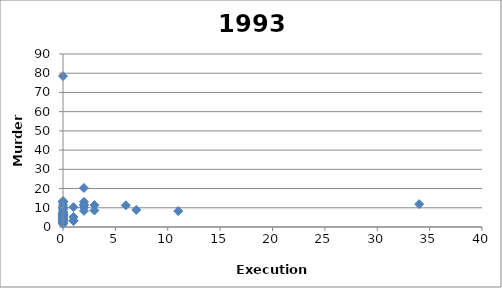
| Category | Series 0 |
|---|---|
| 2.0 | 11.6 |
| 0.0 | 9 |
| 3.0 | 8.6 |
| 2.0 | 10.2 |
| 2.0 | 13.1 |
| 0.0 | 5.8 |
| 0.0 | 6.3 |
| 0.0 | 5 |
| 0.0 | 78.5 |
| 7.0 | 8.9 |
| 3.0 | 11.4 |
| 0.0 | 3.8 |
| 0.0 | 2.9 |
| 0.0 | 11.4 |
| 0.0 | 7.5 |
| 0.0 | 2.3 |
| 0.0 | 6.4 |
| 0.0 | 6.6 |
| 2.0 | 20.3 |
| 0.0 | 1.6 |
| 0.0 | 12.7 |
| 0.0 | 3.9 |
| 0.0 | 9.8 |
| 0.0 | 3.4 |
| 0.0 | 13.5 |
| 6.0 | 11.3 |
| 0.0 | 3 |
| 0.0 | 3.9 |
| 0.0 | 10.4 |
| 0.0 | 2 |
| 0.0 | 5.3 |
| 0.0 | 8 |
| 0.0 | 13.3 |
| 2.0 | 11.3 |
| 0.0 | 1.7 |
| 0.0 | 6 |
| 2.0 | 8.4 |
| 0.0 | 4.6 |
| 0.0 | 6.8 |
| 0.0 | 3.9 |
| 1.0 | 10.3 |
| 0.0 | 3.4 |
| 0.0 | 10.2 |
| 34.0 | 11.9 |
| 1.0 | 3.1 |
| 0.0 | 3.6 |
| 11.0 | 8.3 |
| 1.0 | 5.2 |
| 0.0 | 6.9 |
| 0.0 | 4.4 |
| 1.0 | 3.4 |